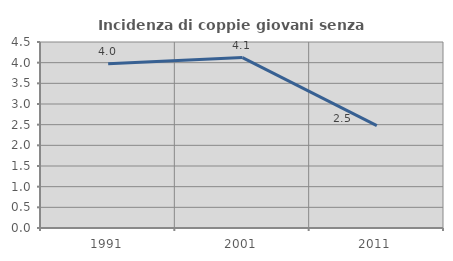
| Category | Incidenza di coppie giovani senza figli |
|---|---|
| 1991.0 | 3.975 |
| 2001.0 | 4.122 |
| 2011.0 | 2.477 |